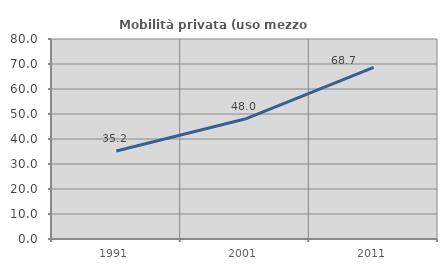
| Category | Mobilità privata (uso mezzo privato) |
|---|---|
| 1991.0 | 35.214 |
| 2001.0 | 47.98 |
| 2011.0 | 68.675 |